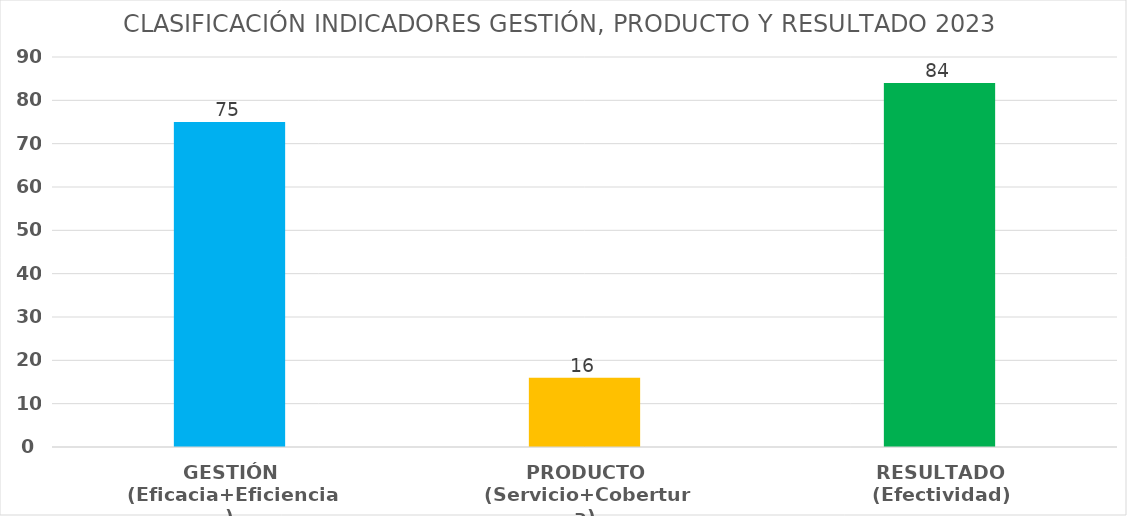
| Category | Series 0 |
|---|---|
| GESTIÓN
(Eficacia+Eficiencia) | 75 |
| PRODUCTO
(Servicio+Cobertura) | 16 |
| RESULTADO
(Efectividad) | 84 |